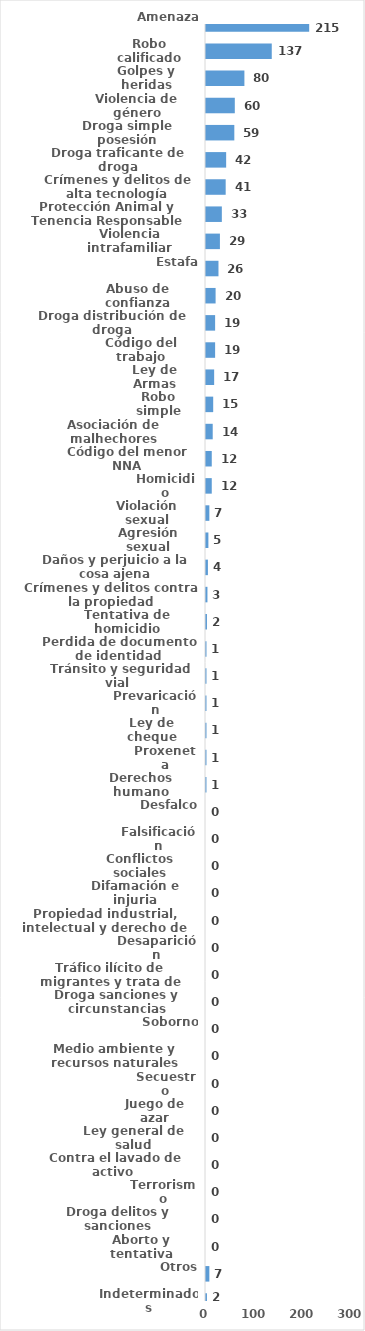
| Category | Series 0 |
|---|---|
| Amenaza | 215 |
| Robo calificado | 137 |
| Golpes y heridas | 80 |
| Violencia de género | 60 |
| Droga simple posesión | 59 |
| Droga traficante de droga | 42 |
| Crímenes y delitos de alta tecnología | 41 |
| Protección Animal y Tenencia Responsable | 33 |
| Violencia intrafamiliar | 29 |
| Estafa | 26 |
| Abuso de confianza | 20 |
| Droga distribución de droga | 19 |
| Código del trabajo | 19 |
| Ley de Armas | 17 |
| Robo simple | 15 |
| Asociación de malhechores | 14 |
| Código del menor NNA | 12 |
| Homicidio | 12 |
| Violación sexual | 7 |
| Agresión sexual | 5 |
| Daños y perjuicio a la cosa ajena | 4 |
| Crímenes y delitos contra la propiedad | 3 |
| Tentativa de homicidio | 2 |
| Perdida de documento de identidad | 1 |
| Tránsito y seguridad vial  | 1 |
| Prevaricación | 1 |
| Ley de cheque | 1 |
| Proxeneta | 1 |
| Derechos humano | 1 |
| Desfalco | 0 |
| Falsificación | 0 |
| Conflictos sociales | 0 |
| Difamación e injuria | 0 |
| Propiedad industrial, intelectual y derecho de autor | 0 |
| Desaparición | 0 |
| Tráfico ilícito de migrantes y trata de personas | 0 |
| Droga sanciones y circunstancias agravantes | 0 |
| Soborno | 0 |
| Medio ambiente y recursos naturales | 0 |
| Secuestro | 0 |
| Juego de azar | 0 |
| Ley general de salud | 0 |
| Contra el lavado de activo  | 0 |
| Terrorismo | 0 |
| Droga delitos y sanciones | 0 |
| Aborto y tentativa | 0 |
| Otros | 7 |
| Indeterminados | 2 |